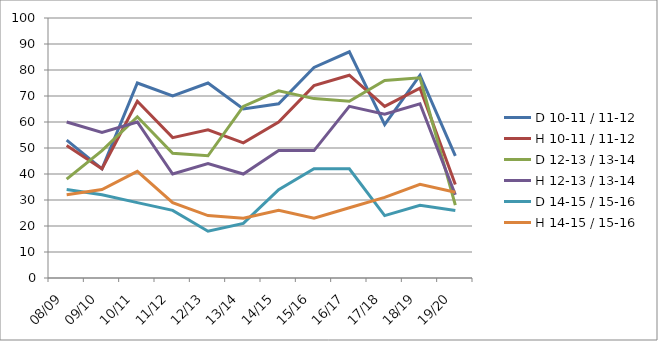
| Category | D 10-11 / 11-12 | H 10-11 / 11-12 | D 12-13 / 13-14 | H 12-13 / 13-14 | D 14-15 / 15-16 | H 14-15 / 15-16 |
|---|---|---|---|---|---|---|
| 08/09 | 53 | 51 | 38 | 60 | 34 | 32 |
| 09/10 | 42 | 42 | 49 | 56 | 32 | 34 |
| 10/11 | 75 | 68 | 62 | 60 | 29 | 41 |
| 11/12 | 70 | 54 | 48 | 40 | 26 | 29 |
| 12/13 | 75 | 57 | 47 | 44 | 18 | 24 |
| 13/14 | 65 | 52 | 66 | 40 | 21 | 23 |
| 14/15 | 67 | 60 | 72 | 49 | 34 | 26 |
| 15/16 | 81 | 74 | 69 | 49 | 42 | 23 |
| 16/17 | 87 | 78 | 68 | 66 | 42 | 27 |
| 17/18 | 59 | 66 | 76 | 63 | 24 | 31 |
| 18/19 | 78 | 73 | 77 | 67 | 28 | 36 |
| 19/20 | 47 | 36 | 28 | 32 | 26 | 33 |